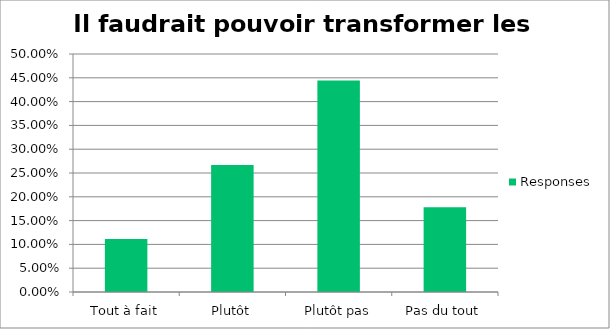
| Category | Responses |
|---|---|
| Tout à fait | 0.111 |
| Plutôt | 0.267 |
| Plutôt pas | 0.444 |
| Pas du tout | 0.178 |